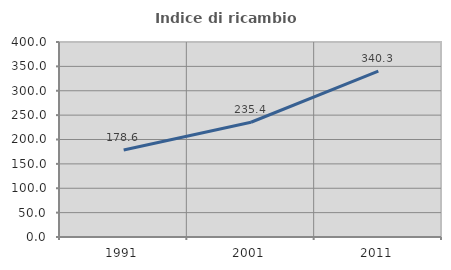
| Category | Indice di ricambio occupazionale  |
|---|---|
| 1991.0 | 178.615 |
| 2001.0 | 235.416 |
| 2011.0 | 340.265 |